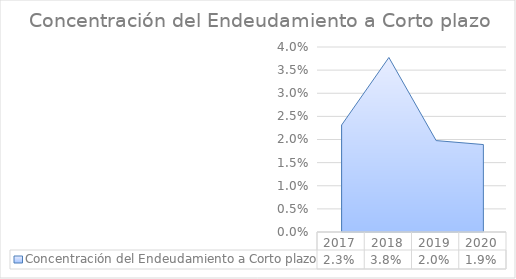
| Category | Concentración del Endeudamiento a Corto plazo |
|---|---|
| 2017.0 | 0.023 |
| 2018.0 | 0.038 |
| 2019.0 | 0.02 |
| 2020.0 | 0.019 |